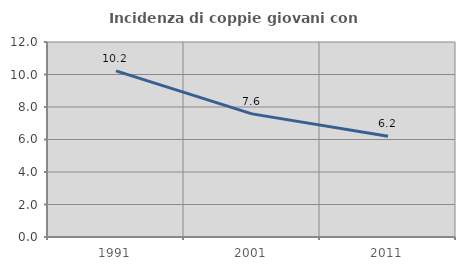
| Category | Incidenza di coppie giovani con figli |
|---|---|
| 1991.0 | 10.219 |
| 2001.0 | 7.576 |
| 2011.0 | 6.202 |